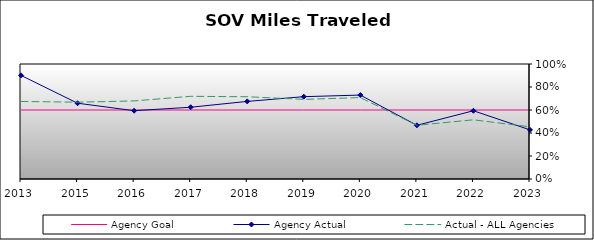
| Category | Agency Goal | Agency Actual | Actual - ALL Agencies |
|---|---|---|---|
| 2013.0 | 0.6 | 0.901 | 0.674 |
| 2015.0 | 0.6 | 0.659 | 0.668 |
| 2016.0 | 0.6 | 0.594 | 0.679 |
| 2017.0 | 0.6 | 0.624 | 0.719 |
| 2018.0 | 0.6 | 0.675 | 0.715 |
| 2019.0 | 0.6 | 0.716 | 0.692 |
| 2020.0 | 0.6 | 0.73 | 0.708 |
| 2021.0 | 0.6 | 0.467 | 0.467 |
| 2022.0 | 0.6 | 0.593 | 0.515 |
| 2023.0 | 0.6 | 0.427 | 0.454 |